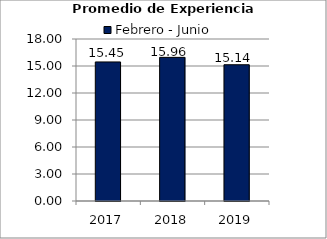
| Category | Febrero - Junio |
|---|---|
| 2017.0 | 15.45 |
| 2018.0 | 15.96 |
| 2019.0 | 15.14 |